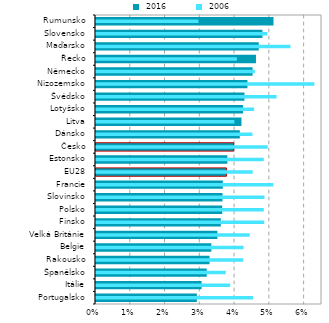
| Category |  2016 |
|---|---|
| Portugalsko | 0.029 |
| Itálie | 0.03 |
| Španělsko | 0.032 |
| Rakousko | 0.033 |
| Belgie | 0.033 |
| Velká Británie | 0.035 |
| Finsko | 0.036 |
| Polsko | 0.036 |
| Slovinsko | 0.036 |
| Francie | 0.036 |
| EU28 | 0.038 |
| Estonsko | 0.038 |
| Česko | 0.04 |
| Dánsko | 0.041 |
| Litva | 0.042 |
| Lotyšsko | 0.042 |
| Švédsko | 0.043 |
| Nizozemsko | 0.044 |
| Německo | 0.045 |
| Řecko | 0.046 |
| Maďarsko | 0.047 |
| Slovensko | 0.048 |
| Rumunsko | 0.051 |